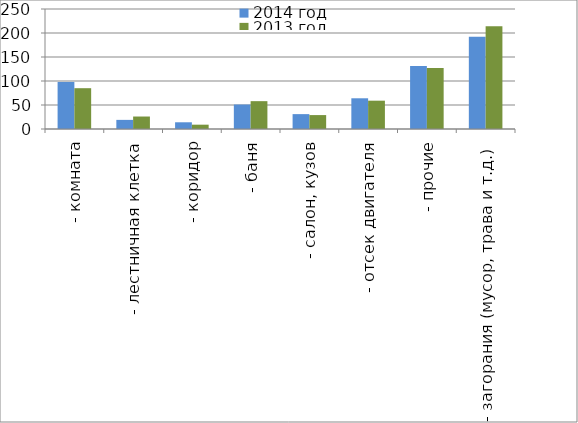
| Category | 2014 год | 2013 год |
|---|---|---|
|  - комната | 98 | 85 |
|  - лестничная клетка | 19 | 26 |
|  - коридор | 14 | 9 |
|  - баня | 51 | 58 |
|  - салон, кузов | 31 | 29 |
|  - отсек двигателя | 64 | 59 |
| - прочие | 131 | 127 |
| - загорания (мусор, трава и т.д.)  | 192 | 214 |